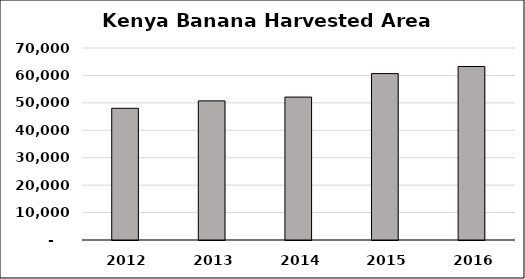
| Category | Series 0 |
|---|---|
| 2012 | 48022 |
| 2013 | 50719 |
| 2014 | 52102 |
| 2015 | 60670 |
| 2016 | 63257 |